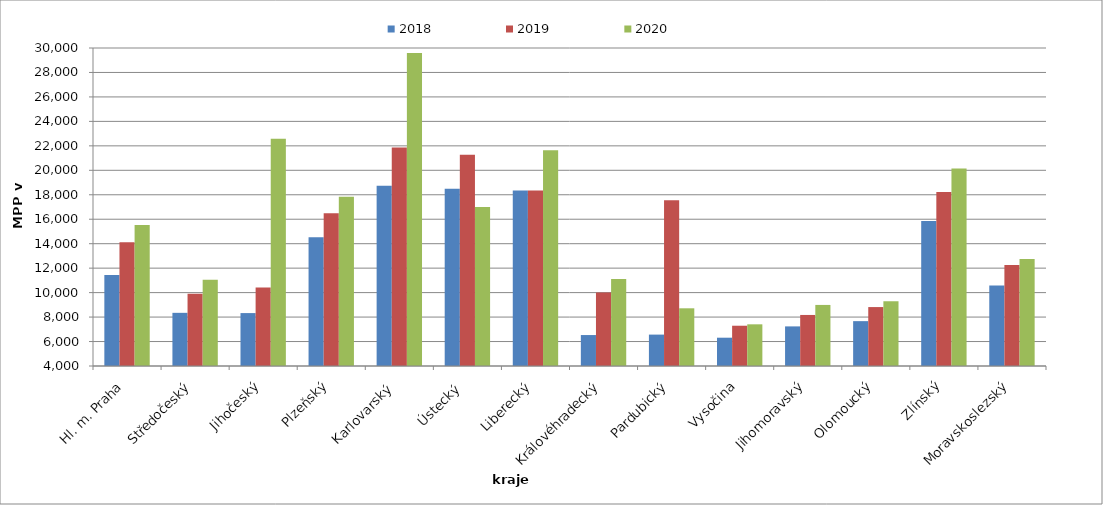
| Category | 2018 | 2019 | 2020 |
|---|---|---|---|
| Hl. m. Praha | 11442.106 | 14118.176 | 15528.418 |
| Středočeský | 8346.935 | 9904.828 | 11043.31 |
| Jihočeský | 8326.713 | 10419.242 | 22577.951 |
| Plzeňský | 14529.459 | 16480.892 | 17841.401 |
| Karlovarský  | 18733.333 | 21866.667 | 29600 |
| Ústecký   | 18493.497 | 21267.487 | 17000.435 |
| Liberecký | 18349.962 | 18349.962 | 21639.233 |
| Královéhradecký | 6530.804 | 10013.961 | 11115.63 |
| Pardubický | 6567.12 | 17554.541 | 8717.297 |
| Vysočina | 6314.039 | 7292.697 | 7407.709 |
| Jihomoravský | 7237.996 | 8173.467 | 8992.786 |
| Olomoucký | 7667.881 | 8818.09 | 9292.625 |
| Zlínský | 15863.664 | 18236.08 | 20152.306 |
| Moravskoslezský | 10571.942 | 12262.59 | 12754.563 |